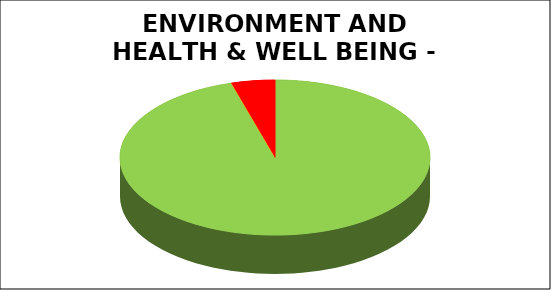
| Category | Series 0 |
|---|---|
| Green | 0.955 |
| Amber | 0 |
| Red | 0.045 |